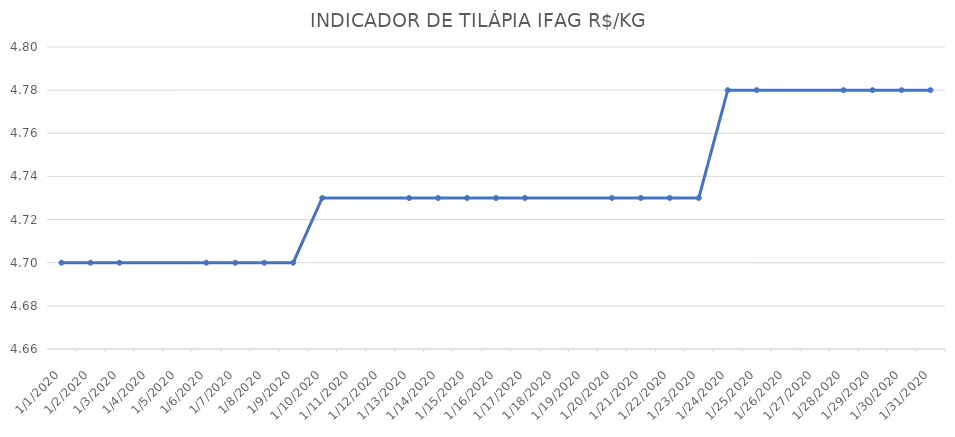
| Category | INDICADOR DE TILÁPIA IFAG |
|---|---|
| 1/1/20 | 4.7 |
| 1/2/20 | 4.7 |
| 1/3/20 | 4.7 |
| 1/6/20 | 4.7 |
| 1/7/20 | 4.7 |
| 1/8/20 | 4.7 |
| 1/9/20 | 4.7 |
| 1/10/20 | 4.73 |
| 1/13/20 | 4.73 |
| 1/14/20 | 4.73 |
| 1/15/20 | 4.73 |
| 1/16/20 | 4.73 |
| 1/17/20 | 4.73 |
| 1/20/20 | 4.73 |
| 1/21/20 | 4.73 |
| 1/22/20 | 4.73 |
| 1/23/20 | 4.73 |
| 1/24/20 | 4.78 |
| 1/25/20 | 4.78 |
| 1/28/20 | 4.78 |
| 1/29/20 | 4.78 |
| 1/30/20 | 4.78 |
| 1/31/20 | 4.78 |